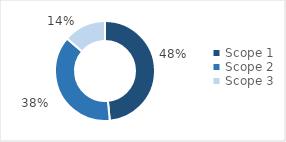
| Category | Series 0 |
|---|---|
| Scope 1 | 816277.144 |
| Scope 2 | 636367.876 |
| Scope 3  | 231624.187 |